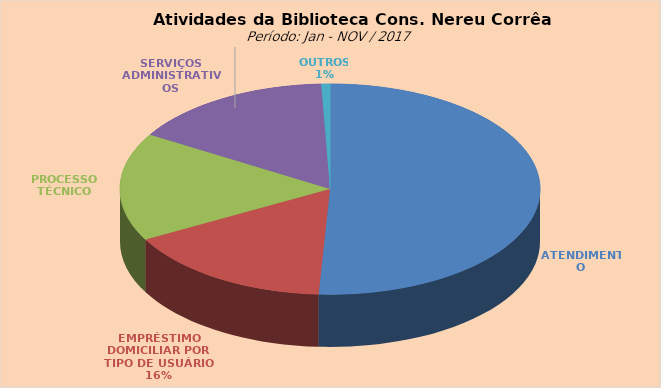
| Category | Series 0 |
|---|---|
| ATENDIMENTO | 12938 |
| EMPRÉSTIMO DOMICILIAR POR TIPO DE USUÁRIO | 4120 |
| PROCESSO TÉCNICO | 4219 |
| SERVIÇOS ADMINISTRATIVOS | 3994 |
| OUTROS | 171 |